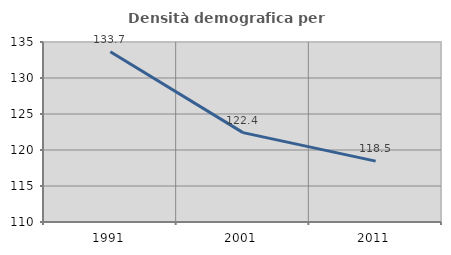
| Category | Densità demografica |
|---|---|
| 1991.0 | 133.655 |
| 2001.0 | 122.417 |
| 2011.0 | 118.454 |